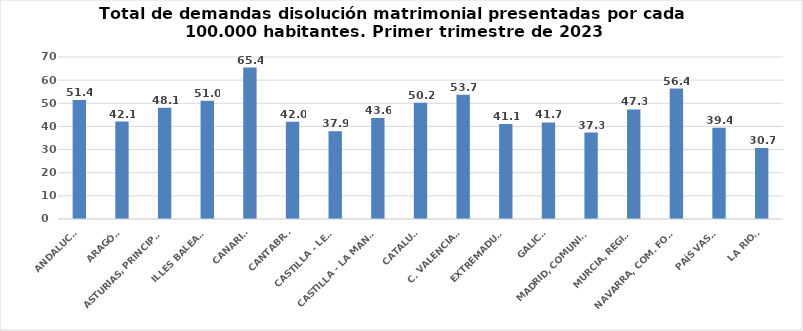
| Category | Series 0 |
|---|---|
| ANDALUCÍA | 51.434 |
| ARAGÓN | 42.095 |
| ASTURIAS, PRINCIPADO | 48.082 |
| ILLES BALEARS | 51.047 |
| CANARIAS | 65.434 |
| CANTABRIA | 41.969 |
| CASTILLA - LEÓN | 37.9 |
| CASTILLA - LA MANCHA | 43.641 |
| CATALUÑA | 50.234 |
| C. VALENCIANA | 53.696 |
| EXTREMADURA | 41.07 |
| GALICIA | 41.708 |
| MADRID, COMUNIDAD | 37.349 |
| MURCIA, REGIÓN | 47.337 |
| NAVARRA, COM. FORAL | 56.382 |
| PAÍS VASCO | 39.416 |
| LA RIOJA | 30.72 |